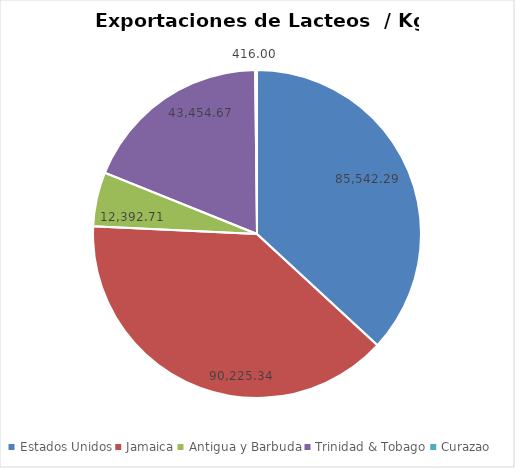
| Category | kg |
|---|---|
| Estados Unidos | 85542.292 |
| Jamaica | 90225.342 |
| Antigua y Barbuda | 12392.71 |
| Trinidad & Tobago | 43454.671 |
| Curazao | 416 |